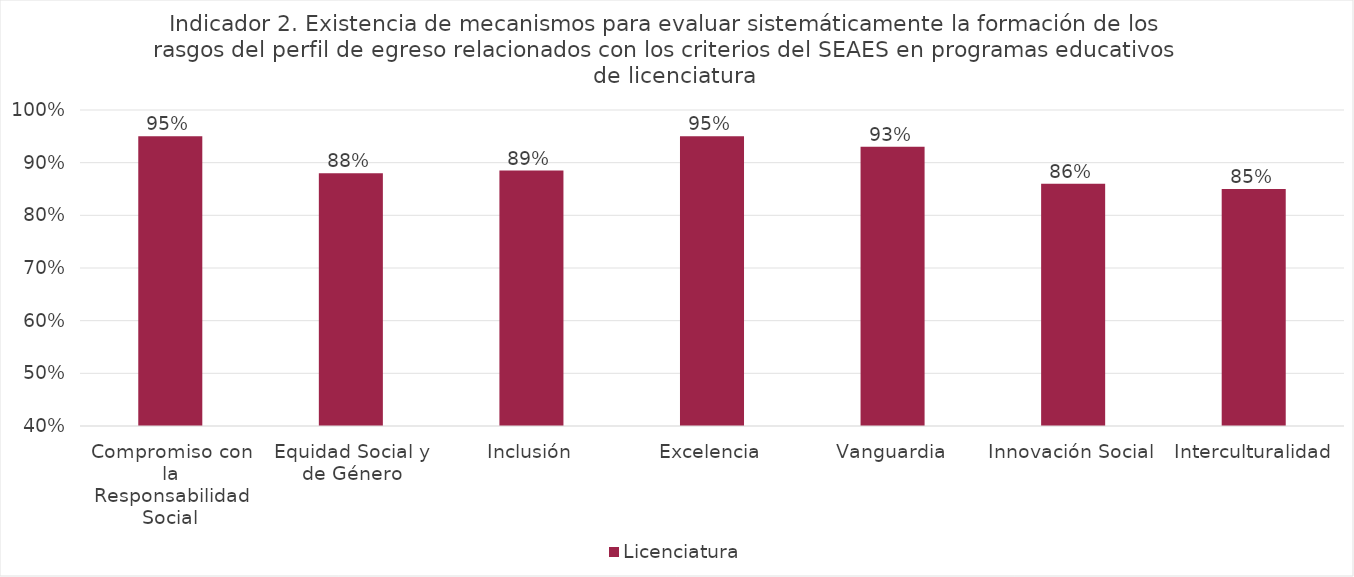
| Category | Licenciatura |
|---|---|
| Compromiso con la Responsabilidad Social | 0.95 |
| Equidad Social y de Género | 0.88 |
| Inclusión | 0.885 |
| Excelencia | 0.95 |
| Vanguardia | 0.93 |
| Innovación Social | 0.86 |
| Interculturalidad | 0.85 |